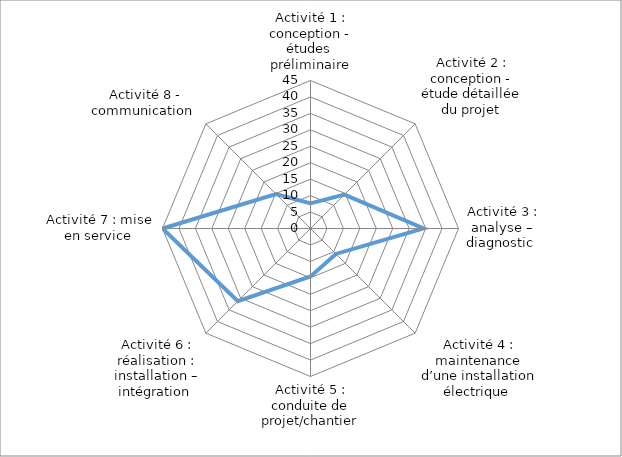
| Category | Series 0 |
|---|---|
| Activité 1 : conception - études  préliminaire | 7.639 |
| Activité 2 : conception - étude détaillée du projet | 14.583 |
| Activité 3 : analyse – diagnostic  | 34.375 |
| Activité 4 : maintenance d’une installation électrique  | 10.938 |
| Activité 5 : conduite de projet/chantier | 14.583 |
| Activité 6 : réalisation : installation – intégration  | 31.25 |
| Activité 7 : mise en service  | 45 |
| Activité 8 - communication  | 14.844 |